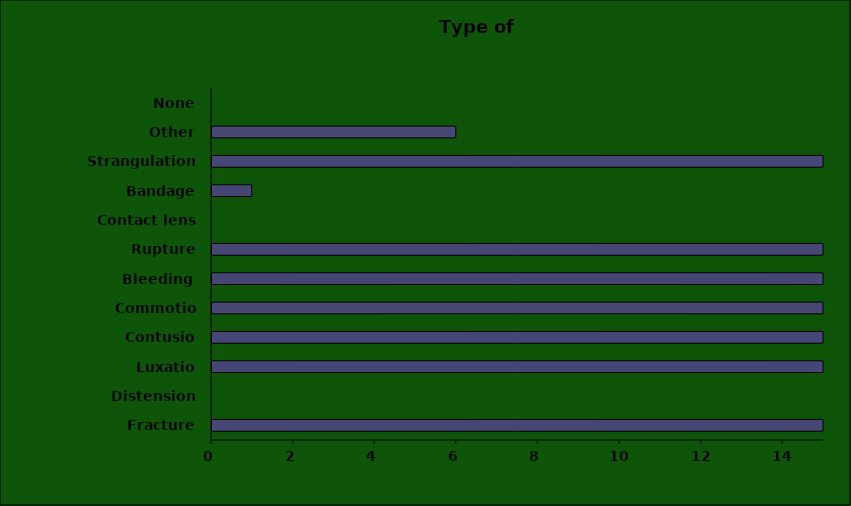
| Category | Series 0 |
|---|---|
| Fracture | 29 |
| Distension | 0 |
| Luxatio | 60 |
| Contusio | 159 |
| Commotio | 19 |
| Bleeding / Excoriatio | 49 |
| Rupture | 27 |
| Contact lens | 0 |
| Bandage | 1 |
| Strangulation | 45 |
| Other | 6 |
| None | 0 |